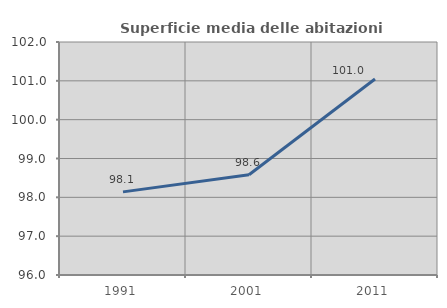
| Category | Superficie media delle abitazioni occupate |
|---|---|
| 1991.0 | 98.14 |
| 2001.0 | 98.582 |
| 2011.0 | 101.049 |